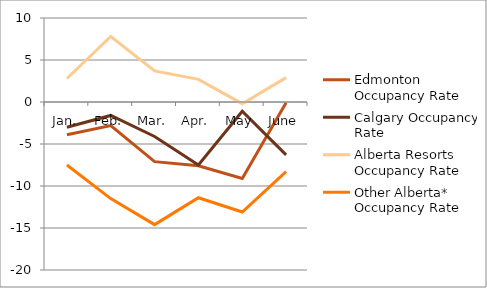
| Category | Edmonton Occupancy Rate | Calgary Occupancy Rate | Alberta Resorts Occupancy Rate | Other Alberta* Occupancy Rate |
|---|---|---|---|---|
| Jan. | -3.9 | -3 | 2.8 | -7.5 |
| Feb. | -2.8 | -1.6 | 7.8 | -11.5 |
| Mar. | -7.1 | -4.1 | 3.7 | -14.6 |
| Apr. | -7.6 | -7.5 | 2.7 | -11.4 |
| May | -9.1 | -1.1 | -0.2 | -13.1 |
| June | -0.1 | -6.3 | 2.9 | -8.3 |